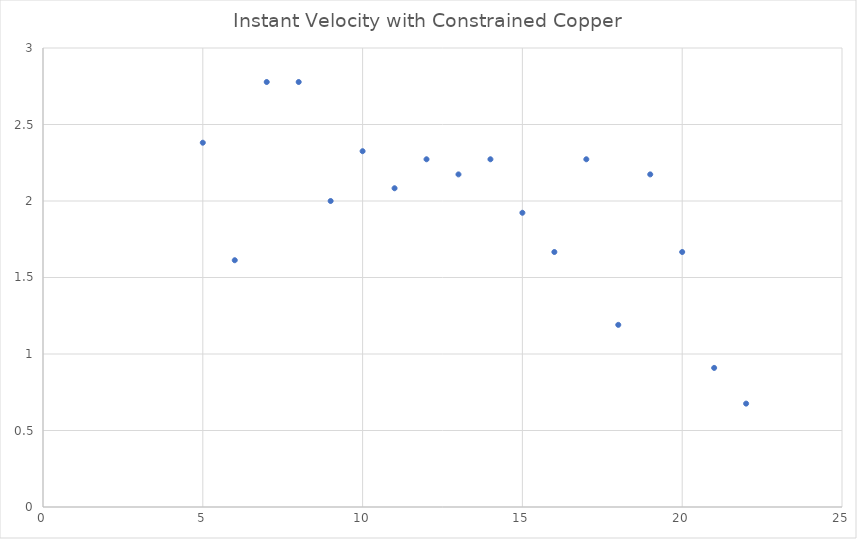
| Category | Series 0 |
|---|---|
| 5.0 | 2.381 |
| 6.0 | 1.613 |
| 7.0 | 2.778 |
| 8.0 | 2.778 |
| 9.0 | 2 |
| 10.0 | 2.326 |
| 11.0 | 2.083 |
| 12.0 | 2.273 |
| 13.0 | 2.174 |
| 14.0 | 2.273 |
| 15.0 | 1.923 |
| 16.0 | 1.667 |
| 17.0 | 2.273 |
| 18.0 | 1.19 |
| 19.0 | 2.174 |
| 20.0 | 1.667 |
| 21.0 | 0.909 |
| 22.0 | 0.676 |